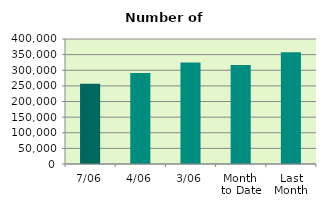
| Category | Series 0 |
|---|---|
| 7/06 | 257194 |
| 4/06 | 291406 |
| 3/06 | 324834 |
| Month 
to Date | 316828 |
| Last
Month | 357760.286 |